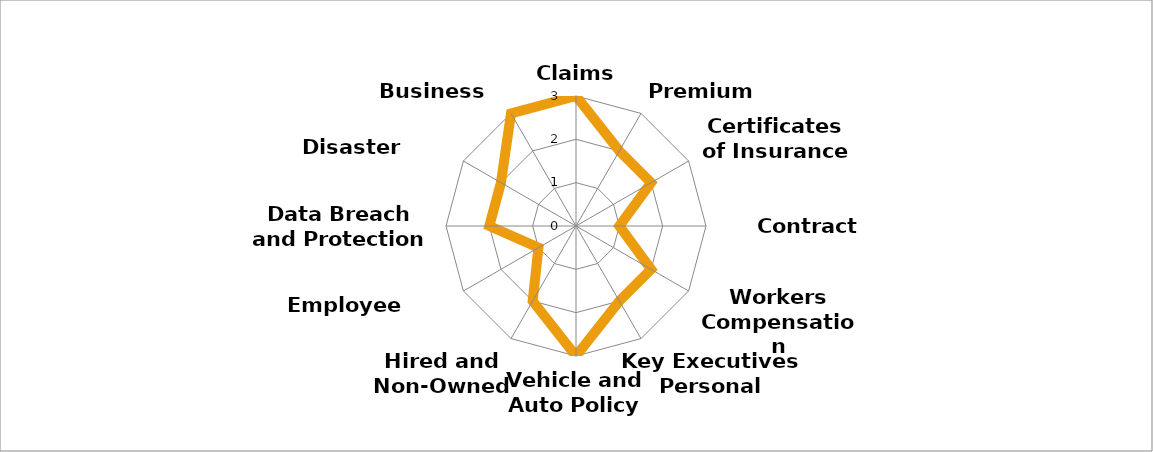
| Category | Series 0 |
|---|---|
| Claims Management | 3 |
| Premium Audit | 2 |
| Certificates of Insurance | 2 |
| Contract Review | 1 |
| Workers Compensation Management | 2 |
| Key Executives Personal Reviews | 2 |
| Vehicle and Auto Policy | 3 |
| Hired and Non-Owned Auto | 2 |
| Employee Wellness | 1 |
| Data Breach and Protection | 2 |
| Disaster Recovery | 2 |
| Business Continuity | 3 |